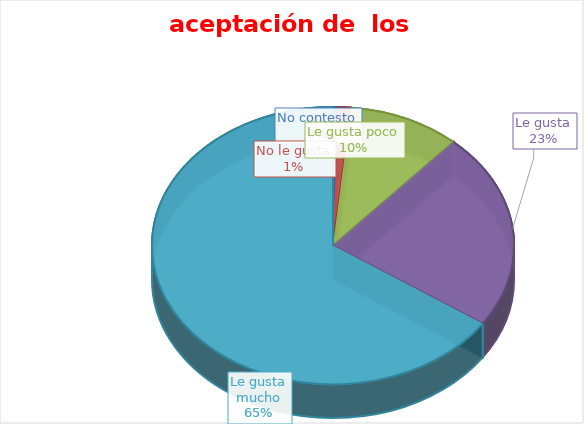
| Category | Series 0 |
|---|---|
| No contesto | 1 |
| No le gusta | 3 |
| Le gusta poco | 25.286 |
| Le gusta | 58 |
| Le gusta mucho | 165.714 |